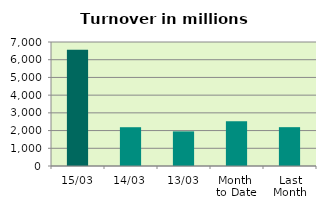
| Category | Series 0 |
|---|---|
| 15/03 | 6563.08 |
| 14/03 | 2189.035 |
| 13/03 | 1953.336 |
| Month 
to Date | 2528.475 |
| Last
Month | 2191.938 |